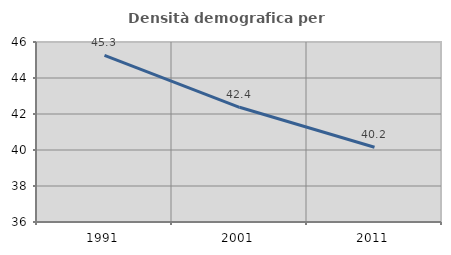
| Category | Densità demografica |
|---|---|
| 1991.0 | 45.256 |
| 2001.0 | 42.372 |
| 2011.0 | 40.154 |